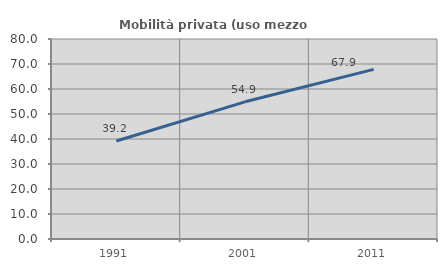
| Category | Mobilità privata (uso mezzo privato) |
|---|---|
| 1991.0 | 39.183 |
| 2001.0 | 54.87 |
| 2011.0 | 67.861 |